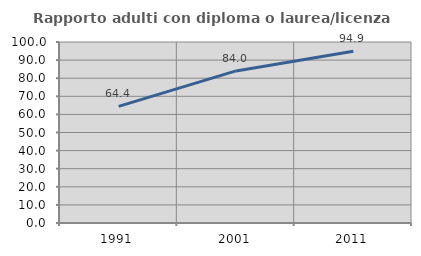
| Category | Rapporto adulti con diploma o laurea/licenza media  |
|---|---|
| 1991.0 | 64.444 |
| 2001.0 | 84.028 |
| 2011.0 | 94.915 |